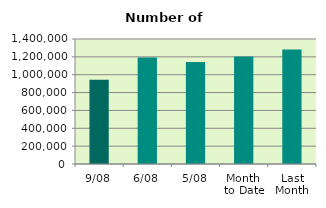
| Category | Series 0 |
|---|---|
| 9/08 | 942592 |
| 6/08 | 1191564 |
| 5/08 | 1141474 |
| Month 
to Date | 1203484 |
| Last
Month | 1281605.545 |